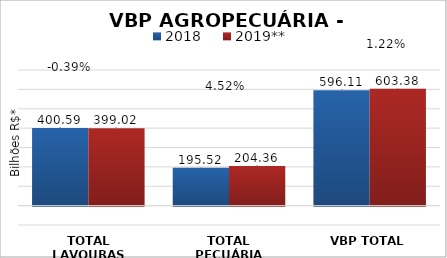
| Category | 2018 | 2019** |
|---|---|---|
| TOTAL LAVOURAS | 400.59 | 399.023 |
| TOTAL PECUÁRIA | 195.523 | 204.356 |
| VBP TOTAL | 596.113 | 603.379 |